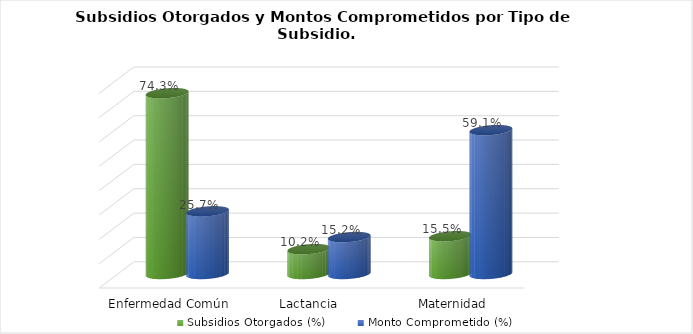
| Category | Subsidios Otorgados (%) | Monto Comprometido (%) |
|---|---|---|
| Enfermedad Común | 0.743 | 0.257 |
| Lactancia  | 0.102 | 0.152 |
| Maternidad | 0.155 | 0.591 |